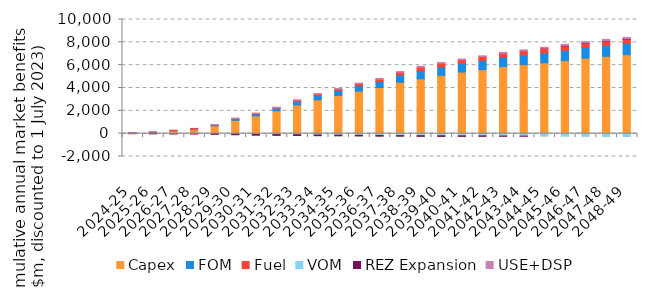
| Category | Capex | FOM | Fuel | VOM | REZ Expansion | USE+DSP |
|---|---|---|---|---|---|---|
| 2024-25 | 0 | 0 | 54.41 | 1.562 | 0.503 | 14.251 |
| 2025-26 | 124.58 | 16.338 | 38.659 | -0.318 | -7.53 | 12.742 |
| 2026-27 | 241.485 | 31.403 | 35.235 | -1.304 | -20.687 | -6.55 |
| 2027-28 | 390.642 | 50.834 | 19.658 | -4.738 | -28.947 | -6.181 |
| 2028-29 | 686.401 | 80.196 | 26.053 | -19.846 | -38.139 | 9.035 |
| 2029-30 | 1163.97 | 132.013 | 40.829 | -46.798 | -46.93 | 22.804 |
| 2030-31 | 1552.771 | 172.687 | 46.679 | -66.96 | -69.388 | 30.995 |
| 2031-32 | 1999.317 | 232.685 | 53.371 | -79.787 | -70.137 | 30.974 |
| 2032-33 | 2513.791 | 309.849 | 96.299 | -96.414 | -64.906 | 49.811 |
| 2033-34 | 2964.57 | 377.781 | 126.98 | -115.543 | -62.55 | 43.818 |
| 2034-35 | 3350.409 | 433.574 | 125.343 | -130.807 | -58.032 | 43.602 |
| 2035-36 | 3720.535 | 487.264 | 179.232 | -145.392 | -55.34 | 39.216 |
| 2036-37 | 4040.902 | 533.942 | 206.556 | -156.446 | -63.116 | 57.32 |
| 2037-38 | 4498.675 | 647.867 | 233.852 | -168.652 | -54.321 | 59.862 |
| 2038-39 | 4800.949 | 692.346 | 331.567 | -176.438 | -60.508 | 70.29 |
| 2039-40 | 5107.701 | 735.346 | 319.531 | -183.698 | -56.624 | 67.333 |
| 2040-41 | 5397.066 | 776.056 | 302.123 | -190.475 | -46.654 | 60.461 |
| 2041-42 | 5611.204 | 798.848 | 353.351 | -197.17 | -35.957 | 53.314 |
| 2042-43 | 5874.457 | 835.981 | 336.779 | -206.656 | -21.867 | 75.343 |
| 2043-44 | 6045.44 | 852.649 | 372.119 | -215.5 | -7.457 | 71.187 |
| 2044-45 | 6204.785 | 868.182 | 398.602 | -219.492 | 11.883 | 84.301 |
| 2045-46 | 6396.943 | 900.495 | 383.917 | -226.237 | 36.539 | 107.352 |
| 2046-47 | 6611.199 | 938.161 | 361.252 | -236.9 | 38.992 | 115.683 |
| 2047-48 | 6770.3 | 968.907 | 368.621 | -242.983 | 38.63 | 116.14 |
| 2048-49 | 6920.859 | 994.733 | 357.298 | -248.35 | 38.942 | 116.044 |